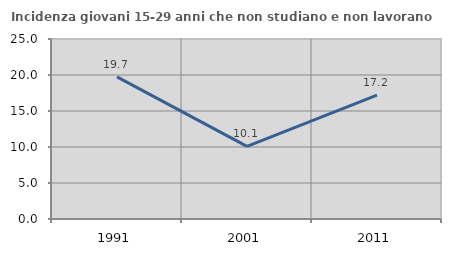
| Category | Incidenza giovani 15-29 anni che non studiano e non lavorano  |
|---|---|
| 1991.0 | 19.74 |
| 2001.0 | 10.083 |
| 2011.0 | 17.216 |